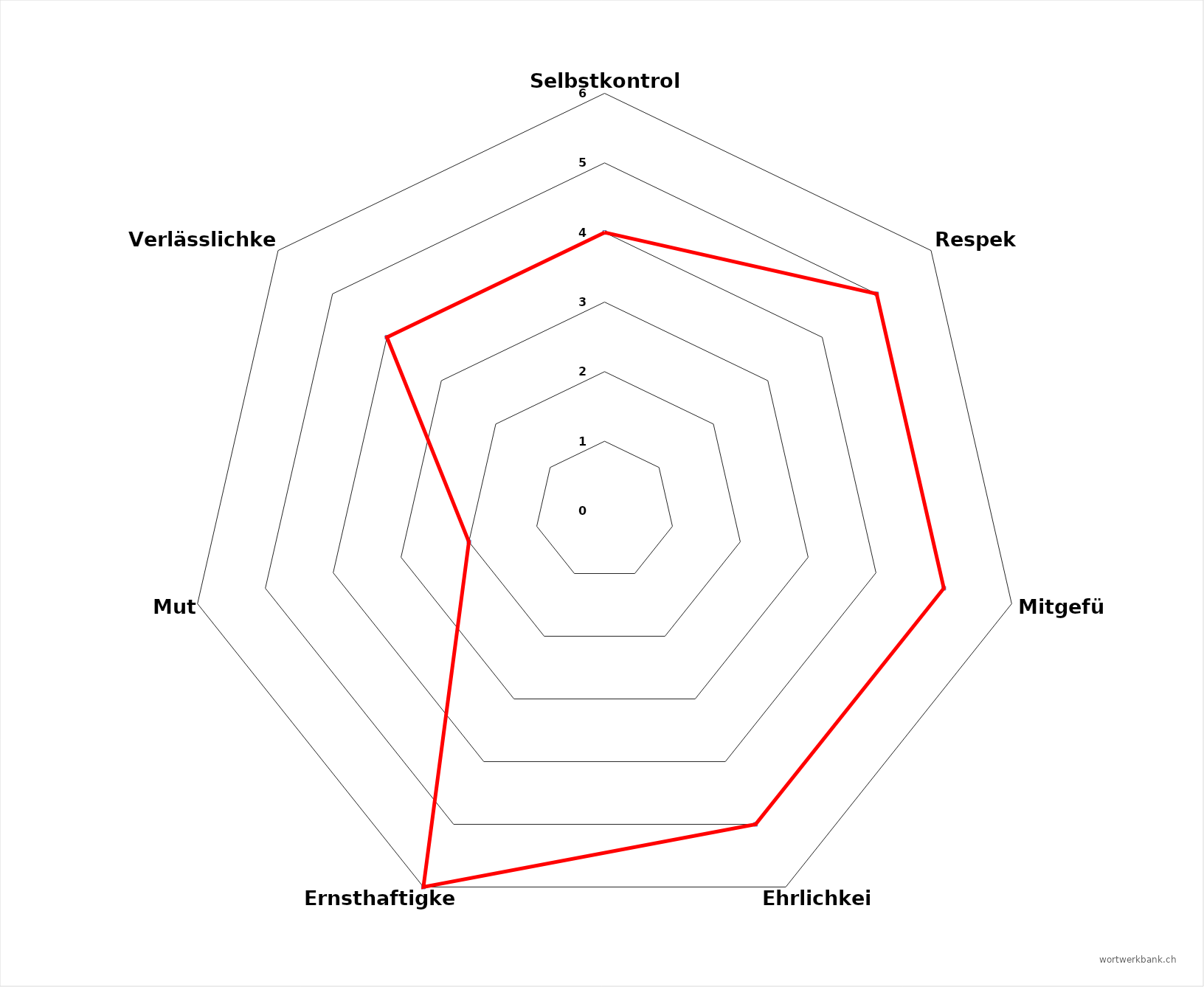
| Category | Series 0 |
|---|---|
| Selbstkontrolle | 4 |
| Respekt | 5 |
| Mitgefühl | 5 |
| Ehrlichkeit | 5 |
| Ernsthaftigkeit | 6 |
| Mut | 2 |
| Verlässlichkeit | 4 |